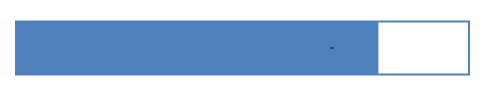
| Category | Actual | Target | Last year |
|---|---|---|---|
| 0 | 80 | 100 | 70 |